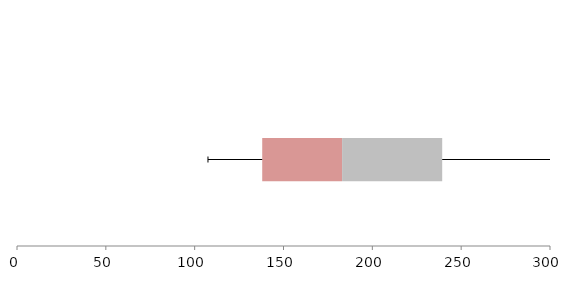
| Category | Series 1 | Series 2 | Series 3 |
|---|---|---|---|
| 0 | 138.024 | 44.96 | 56.337 |